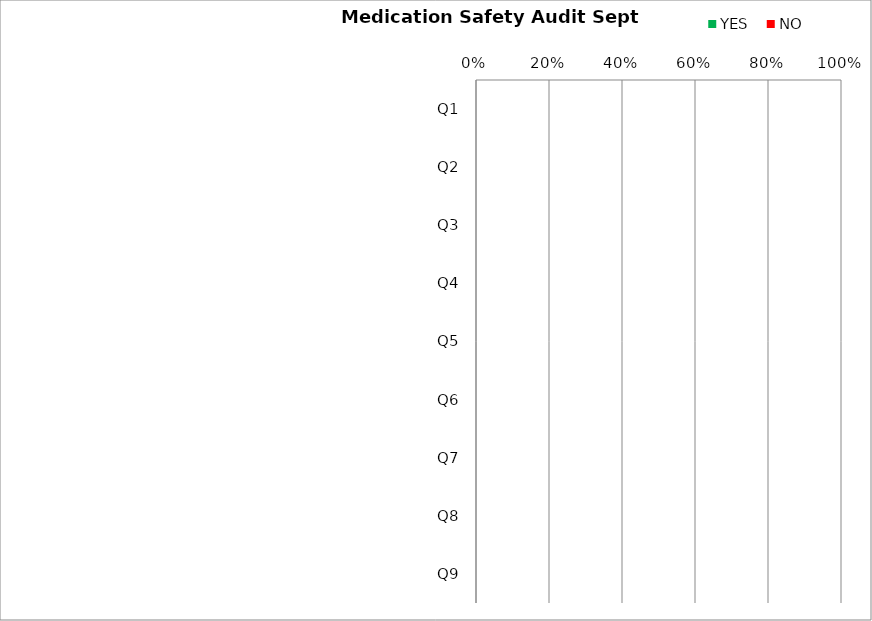
| Category | YES | NO |
|---|---|---|
| Q1 | 0 | 0 |
| Q2 | 0 | 0 |
| Q3 | 0 | 0 |
| Q4 | 0 | 0 |
| Q5 | 0 | 0 |
| Q6 | 0 | 0 |
| Q7 | 0 | 0 |
| Q8 | 0 | 0 |
| Q9 | 0 | 0 |